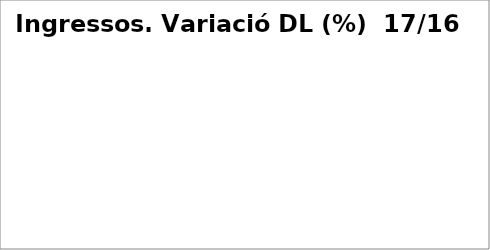
| Category | Series 0 |
|---|---|
| Impostos directes | 0.064 |
| Impostos indirectes | 0.119 |
| Taxes, preus públics i altres ingressos | -0.233 |
| Transferències corrents | 0.005 |
| Ingressos patrimonials | -0.264 |
| Venda d'inversions reals | 6.071 |
| Transferències de capital | 0 |
| Actius financers* | -1 |
| Passius financers | 0.581 |